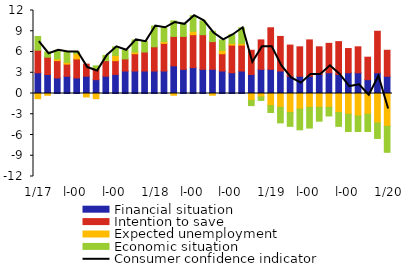
| Category | Financial situation | Intention to save | Expected unemployment | Economic situation |
|---|---|---|---|---|
| 0 | 3 | 3.25 | -0.75 | 2 |
| 1900-01-01 | 2.75 | 2.5 | -0.25 | 0.75 |
| 1900-01-02 | 2.25 | 2.5 | 0.25 | 1.25 |
| 1900-01-03 | 2.5 | 1.75 | 0.25 | 1.5 |
| 1900-01-04 | 2.25 | 2.75 | 0.75 | 0.25 |
| 1900-01-05 | 2.5 | 1.75 | -0.5 | 0 |
| 1900-01-06 | 2 | 1.5 | -0.75 | 0.5 |
| 1900-01-07 | 2.5 | 2.25 | 0 | 0.75 |
| 1900-01-08 | 2.75 | 2 | 0.75 | 1.25 |
| 1900-01-09 | 3.25 | 1.75 | 0 | 1.25 |
| 1900-01-10 | 3.25 | 2.5 | 0.25 | 1.75 |
| 1900-01-11 | 3.25 | 2.75 | 0 | 1.5 |
| 1900-01-12 | 3.25 | 3.5 | 0 | 3 |
| 1900-01-13 | 3.25 | 4 | 0.25 | 2 |
| 1900-01-14 | 4 | 4.25 | -0.25 | 2.25 |
| 1900-01-15 | 3.5 | 4.75 | 0 | 1.75 |
| 1900-01-16 | 3.75 | 4.75 | 0.5 | 2.25 |
| 1900-01-17 | 3.5 | 5 | 0 | 2 |
| 1900-01-18 | 3.5 | 4 | -0.25 | 1.5 |
| 1900-01-19 | 3.25 | 2.5 | 0.5 | 1.5 |
| 1900-01-20 | 3 | 4 | 0.25 | 1.25 |
| 1900-01-21 | 3.25 | 3.75 | 0.25 | 2.25 |
| 1900-01-22 | 2.75 | 3.5 | -1 | -0.75 |
| 1900-01-23 | 3.5 | 4.25 | -0.5 | -0.5 |
| 1900-01-24 | 3.5 | 6 | -1.75 | -1 |
| 1900-01-25 | 3.25 | 5 | -2 | -2.25 |
| 1900-01-26 | 2.5 | 4.5 | -2.75 | -2 |
| 1900-01-27 | 2.5 | 4.25 | -2.25 | -3 |
| 1900-01-28 | 2.5 | 5.25 | -2 | -3 |
| 1900-01-29 | 2.75 | 4 | -2 | -2 |
| 1900-01-30 | 3 | 4.25 | -2 | -1.25 |
| 1900-01-31 | 2.75 | 4.75 | -2.75 | -2 |
| 1900-02-01 | 3 | 3.5 | -3 | -2.5 |
| 1900-02-02 | 3 | 3.75 | -3.25 | -2.25 |
| 1900-02-03 | 2 | 3.25 | -3 | -2.5 |
| 1900-02-04 | 3 | 6 | -4.25 | -2.25 |
| 1900-02-05 | 2.5 | 3.75 | -4.75 | -3.75 |